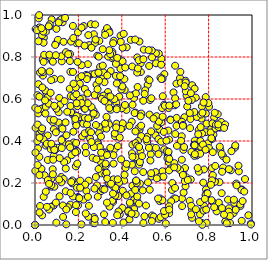
| Category | y wykres |
|---|---|
| 0.595156333497665 | 0.573 |
| 0.0 | 0 |
| 0.6885195955051244 | 0.513 |
| 0.7686208502139633 | 0.01 |
| 0.17133730488844923 | 0.198 |
| 0.0 | 0 |
| 0.39359969500127345 | 0.744 |
| 0.39717534863096915 | 0.703 |
| 0.375502533048806 | 0.482 |
| 0.1647447185980644 | 0.614 |
| 0.5332731022230875 | 0.337 |
| 0.09676642713919814 | 0.865 |
| 0.5173381343364102 | 0.396 |
| 0.0 | 0 |
| 0.44139861103197064 | 0.094 |
| 0.2579029819581121 | 0.956 |
| 0.7882438199083921 | 0.169 |
| 0.3029363502844006 | 0.161 |
| 0.3665575476958771 | 0.361 |
| 0.16306868091016113 | 0.729 |
| 0.5292788364736167 | 0.595 |
| 0.011467501616257425 | 0.618 |
| 0.0 | 0 |
| 0.020958516006236327 | 0.435 |
| 0.6169734149224206 | 0.299 |
| 0.6854858364601307 | 0.26 |
| 0.0589720041967573 | 0.31 |
| 0.48610777583849585 | 0.352 |
| 0.32900162032509783 | 0.341 |
| 0.8766625762106434 | 0.016 |
| 0.6155212446640451 | 0.557 |
| 0.005378145765442377 | 0.254 |
| 0.19865823551639417 | 0.133 |
| 0.7366285990639404 | 0.402 |
| 0.5739438314274691 | 0.456 |
| 0.4372969176489593 | 0.066 |
| 0.08570173656289648 | 0.093 |
| 0.3104388231552151 | 0.46 |
| 0.0 | 0 |
| 0.0 | 0 |
| 0.811707751439313 | 0.456 |
| 0.0 | 0 |
| 0.0 | 0 |
| 0.0 | 0 |
| 0.7970631233592428 | 0.389 |
| 0.18965817422453413 | 0.202 |
| 0.04431707109298155 | 0.563 |
| 0.2494150667135896 | 0.857 |
| 0.0 | 0 |
| 0.7757191672186811 | 0.202 |
| 0.2657520407859022 | 0.32 |
| 0.08152979641203051 | 0.265 |
| 0.9466348261789832 | 0.09 |
| 0.0 | 0 |
| 0.4110165986825157 | 0.212 |
| 0.22345351486812093 | 0.121 |
| 0.0 | 0 |
| 0.18825623695239402 | 0.279 |
| 0.5178212850032925 | 0.42 |
| 0.0 | 0 |
| 0.07900252235229088 | 0.781 |
| 0.5704608825235218 | 0.489 |
| 0.0728605069764795 | 0.087 |
| 0.0 | 0 |
| 0.0862923871927902 | 0.329 |
| 0.3592843563848892 | 0.11 |
| 0.7675511702534963 | 0.507 |
| 0.19727930188021048 | 0.51 |
| 0.22716374956621743 | 0.555 |
| 0.0 | 0 |
| 0.22199986153720297 | 0.482 |
| 0.8541284013746843 | 0.357 |
| 0.3881053016917948 | 0.79 |
| 0.9150355595004286 | 0.057 |
| 0.7873026059592866 | 0.139 |
| 0.7421153306515681 | 0.375 |
| 0.5956930373246876 | 0.361 |
| 0.0 | 0 |
| 0.7607289662879398 | 0.051 |
| 0.4413163206051708 | 0.882 |
| 0.0 | 0 |
| 0.6541920801000015 | 0.377 |
| 0.0 | 0 |
| 0.023333731022755932 | 0.09 |
| 0.1608136580234384 | 0.781 |
| 0.09862647201231844 | 0.934 |
| 0.1727185494731598 | 0.527 |
| 0.34951323499654885 | 0.549 |
| 0.2472469719349818 | 0.211 |
| 0.48350653171994085 | 0.197 |
| 0.37762215343723193 | 0.557 |
| 0.677402270309556 | 0.126 |
| 0.3510573572169713 | 0.207 |
| 0.0 | 0 |
| 0.0 | 0 |
| 0.8896387859335202 | 0.121 |
| 0.10981754436351587 | 0.488 |
| 0.5766772161984283 | 0.237 |
| 0.9833386107245164 | 0.046 |
| 0.7908794285423901 | 0.01 |
| 0.0 | 0 |
| 0.04072576067504796 | 0.892 |
| 0.27556417863034766 | 0.532 |
| 0.8502060630857499 | 0.204 |
| 0.0 | 0 |
| 0.5825554038144221 | 0.791 |
| 0.0 | 0 |
| 0.21904186383360147 | 0.603 |
| 0.7871956056563801 | 0.531 |
| 0.6984876003136892 | 0.617 |
| 0.8220733808104578 | 0.431 |
| 0.06462107313685306 | 0.074 |
| 0.0 | 0 |
| 0.0 | 0 |
| 0.48209326938159547 | 0.454 |
| 0.010546998915361261 | 0.399 |
| 0.55585268740819 | 0.427 |
| 0.3563658531563273 | 0.794 |
| 0.3943318753851275 | 0.902 |
| 0.6114963629401723 | 0.332 |
| 0.035762473990057386 | 0.788 |
| 0.7868007260229806 | 0.442 |
| 0.7208870339370846 | 0.348 |
| 0.11327522359810749 | 0.137 |
| 0.11203771261251438 | 0.605 |
| 0.3225437619157687 | 0.346 |
| 0.0 | 0 |
| 0.12937776201493856 | 0.038 |
| 0.0 | 0 |
| 0.7794501088063771 | 0.09 |
| 0.30418551038580677 | 0.298 |
| 0.36892939769919564 | 0.422 |
| 0.029820838806128958 | 0.268 |
| 0.33486641753719837 | 0.491 |
| 0.5688018261508931 | 0.409 |
| 0.0 | 0 |
| 0.0 | 0 |
| 0.7544130027953414 | 0.453 |
| 0.0 | 0 |
| 0.28343642789744594 | 0.668 |
| 0.695585211673965 | 0.229 |
| 0.3720562080553167 | 0.139 |
| 0.6464937996499207 | 0.433 |
| 0.0 | 0 |
| 0.40878132126357125 | 0.91 |
| 0.2024910767613628 | 0.699 |
| 0.1978996951507277 | 0.917 |
| 0.0 | 0 |
| 0.0 | 0 |
| 0.6518590124788647 | 0.673 |
| 0.4457824974003516 | 0.492 |
| 0.03998519542707679 | 0.134 |
| 0.5604815555638752 | 0.518 |
| 0.5740371922106263 | 0.114 |
| 0.14406822556387733 | 0.003 |
| 0.80197122457899 | 0.564 |
| 0.4566451397965048 | 0.12 |
| 0.3565922999602217 | 0.824 |
| 0.5403556352259219 | 0.825 |
| 0.4798955981573706 | 0.288 |
| 0.48721401229981975 | 0.77 |
| 0.4895688019926061 | 0.423 |
| 0.19111007750782993 | 0.866 |
| 0.0 | 0 |
| 0.0758718913322538 | 0.221 |
| 0.0 | 0 |
| 0.0 | 0 |
| 0.2435666157616645 | 0.766 |
| 0.562960107413229 | 0.472 |
| 0.37303791334114655 | 0.768 |
| 0.42186332974798935 | 0.286 |
| 0.9025222845307982 | 0.261 |
| 0.27126066880289557 | 0.038 |
| 0.8100323506578163 | 0.441 |
| 0.0 | 0 |
| 0.47454575383200104 | 0.4 |
| 0.14811980732485064 | 0.308 |
| 0.01525626622182119 | 0.532 |
| 0.41333519886499503 | 0.643 |
| 0.24582108117069368 | 0.039 |
| 0.23266971102267964 | 0.372 |
| 0.0 | 0 |
| 0.8370627931553972 | 0.065 |
| 0.9677706148915555 | 0.219 |
| 0.4812344437167917 | 0.874 |
| 0.5706177165314976 | 0.816 |
| 0.0 | 0 |
| 0.7906706780027649 | 0.483 |
| 0.0 | 0 |
| 0.6108439298324833 | 0.346 |
| 0.46671866797281003 | 0.316 |
| 0.0 | 0 |
| 0.0 | 0 |
| 0.08677005602828103 | 0.456 |
| 0.332752333190821 | 0.918 |
| 0.8663776764621534 | 0.328 |
| 0.0 | 0 |
| 0.5870246345805046 | 0.256 |
| 0.07650090884035632 | 0.182 |
| 0.175105164314302 | 0.532 |
| 0.7241231349461472 | 0.666 |
| 0.47129533740857565 | 0.798 |
| 0.07682176319440459 | 0.979 |
| 0.5348369509635977 | 0.446 |
| 0.0 | 0 |
| 0.253887082119572 | 0.412 |
| 0.777061019253081 | 0.069 |
| 0.8155193914322048 | 0.271 |
| 0.21461757736804243 | 0.761 |
| 0.38807244632719395 | 0.611 |
| 0.4490294752150058 | 0.382 |
| 0.6329880216551783 | 0.2 |
| 0.7212015410892673 | 0.596 |
| 0.46475390424118446 | 0.323 |
| 0.2086235694756784 | 0.211 |
| 0.12336351698994097 | 0.779 |
| 0.2751316975243019 | 0.619 |
| 0.0 | 0 |
| 0.11979732160855594 | 0.212 |
| 0.7356183763723242 | 0.649 |
| 0.0 | 0 |
| 0.0 | 0 |
| 0.06743240341618428 | 0.946 |
| 0.02030466577215162 | 0.324 |
| 0.08217272593958358 | 0.49 |
| 0.20043754700145655 | 0.13 |
| 0.4320743096703036 | 0.067 |
| 0.12119667517928012 | 0.229 |
| 0.3474504787875389 | 0.809 |
| 0.0 | 0 |
| 0.09619855776001685 | 0.441 |
| 0.3120858410807352 | 0.279 |
| 0.7410212046657405 | 0.607 |
| 0.26942823256497395 | 0.544 |
| 0.2578178938764071 | 0.717 |
| 0.0 | 0 |
| 0.9533521737170186 | 0.169 |
| 0.0 | 0 |
| 0.4627076476332037 | 0.535 |
| 0.05305133941874551 | 0.627 |
| 0.032642562285527865 | 0.904 |
| 0.7451339187093207 | 0.514 |
| 0.9183188112436315 | 0.106 |
| 0.717909749716205 | 0.217 |
| 0.13209377668349964 | 0.219 |
| 0.31465618168985265 | 0.704 |
| 0.0 | 0 |
| 0.3241559988935515 | 0.92 |
| 0.7319873457040196 | 0.382 |
| 0.7162447556060165 | 0.505 |
| 0.5558570119708117 | 0.252 |
| 0.3035060586359203 | 0.611 |
| 0.1629436631434632 | 0.097 |
| 0.8582138620368743 | 0.49 |
| 0.4634530249903618 | 0.39 |
| 0.16623698824522315 | 0.537 |
| 0.40361847548248275 | 0.78 |
| 0.10578226923420952 | 0.882 |
| 0.5391978335185812 | 0.045 |
| 0.16410971552536702 | 0.567 |
| 0.1884658456995122 | 0.062 |
| 0.20633151766446534 | 0.601 |
| 0.3693640355847321 | 0.148 |
| 0.42135165495390037 | 0.548 |
| 0.4419113298122952 | 0.15 |
| 0.0 | 0 |
| 0.8255154891589763 | 0.512 |
| 0.5193622570658065 | 0.668 |
| 0.0397689208373152 | 0.868 |
| 0.0 | 0 |
| 0.21811305264918113 | 0.422 |
| 0.0 | 0 |
| 0.0 | 0 |
| 0.5960910867822353 | 0.719 |
| 0.0 | 0 |
| 0.7709270331202953 | 0.001 |
| 0.8287449134229038 | 0.208 |
| 0.029704475515036965 | 0.45 |
| 0.0 | 0 |
| 0.9248204566748391 | 0.072 |
| 0.05769598233121287 | 0.608 |
| 0.15161825064148915 | 0.085 |
| 0.9525851419505952 | 0.02 |
| 0.5463921768882142 | 0.04 |
| 0.0 | 0 |
| 0.0 | 0 |
| 0.456842753817301 | 0.076 |
| 0.3906694753739498 | 0.05 |
| 0.0 | 0 |
| 0.1746180230980806 | 0.948 |
| 0.5712694087205182 | 0.029 |
| 0.0 | 0 |
| 0.3151468429718359 | 0.343 |
| 0.47962823560456114 | 0.464 |
| 0.0 | 0 |
| 0.2998814046949826 | 0.753 |
| 0.3746544656032046 | 0.581 |
| 0.0 | 0 |
| 0.4776384694025565 | 0.785 |
| 0.0 | 0 |
| 0.4321066288306318 | 0.069 |
| 0.09218626392992557 | 0.356 |
| 0.6423072945921035 | 0.295 |
| 0.723796857851313 | 0.034 |
| 0.48774582794565124 | 0.729 |
| 0.0 | 0 |
| 0.08396756021632767 | 0.311 |
| 0.22462127479357308 | 0.947 |
| 0.19507414121697397 | 0.292 |
| 0.5814944473723835 | 0.397 |
| 0.33966996361542234 | 0.927 |
| 0.002559236698768008 | 0.462 |
| 0.020028804267735345 | 0.941 |
| 0.0 | 0 |
| 0.03633561233620353 | 0.711 |
| 0.0 | 0 |
| 0.04990974137047233 | 0.159 |
| 0.6766233410461063 | 0.311 |
| 0.45889693492589456 | 0.533 |
| 0.0 | 0 |
| 0.0 | 0 |
| 0.0 | 0 |
| 0.02302559343860655 | 0.726 |
| 0.6315267713792033 | 0.167 |
| 0.33195980383533485 | 0.938 |
| 0.0 | 0 |
| 0.4080438292242097 | 0.012 |
| 0.33707040796256393 | 0.802 |
| 0.0 | 0 |
| 0.3384054754973237 | 0.576 |
| 0.0 | 0 |
| 0.0 | 0 |
| 0.0 | 0 |
| 0.6123889150302428 | 0.321 |
| 0.9209596851691609 | 0.368 |
| 0.8485833364785449 | 0.09 |
| 0.0 | 0 |
| 0.0 | 0 |
| 0.28895544047600286 | 0.393 |
| 0.0 | 0 |
| 0.7145529129899972 | 0.461 |
| 0.5877259222901027 | 0.696 |
| 0.7131778000038129 | 0.115 |
| 0.0 | 0 |
| 0.0 | 0 |
| 0.9948719451280921 | 0.007 |
| 0.33845048537849876 | 0.199 |
| 0.6180885767642564 | 0.056 |
| 0.7866662066161386 | 0.609 |
| 0.8288429500784003 | 0.206 |
| 0.6949161694245096 | 0.637 |
| 0.0 | 0 |
| 0.8515367868780247 | 0.373 |
| 0.8940508090499022 | 0.08 |
| 0.44697252301946166 | 0.342 |
| 0.04804399763854894 | 0.64 |
| 0.8470736436626006 | 0.107 |
| 0.816278657289002 | 0.409 |
| 0.21458076765926337 | 0.94 |
| 0.4491511254979036 | 0.325 |
| 0.012044700109383855 | 0.478 |
| 0.30713513452219576 | 0.246 |
| 0.0 | 0 |
| 0.0 | 0 |
| 0.3987087372117215 | 0.646 |
| 0.05884420460734796 | 0.426 |
| 0.017128265818089128 | 0.984 |
| 0.0 | 0 |
| 0.0 | 0 |
| 0.9459669638826153 | 0.098 |
| 0.17723673454356026 | 0.611 |
| 0.0 | 0 |
| 0.7457680055787491 | 0.331 |
| 0.07111581948335144 | 0.797 |
| 0.0 | 0 |
| 0.1269540877493176 | 0.411 |
| 0.6071173478497507 | 0.351 |
| 0.3603409054227026 | 0.801 |
| 0.4546618234904939 | 0.62 |
| 0.3102665003042222 | 0.326 |
| 0.3768633381609343 | 0.188 |
| 0.27118030109297464 | 0.908 |
| 0.0 | 0 |
| 0.6179236459948844 | 0.407 |
| 0.6103514903791866 | 0.318 |
| 0.07049897195972954 | 0.502 |
| 0.0 | 0 |
| 0.23385930645473318 | 0.055 |
| 0.6433515583291819 | 0.57 |
| 0.0363511032645486 | 0.728 |
| 0.3423725729335292 | 0.197 |
| 0.2298388110927434 | 0.648 |
| 0.0 | 0 |
| 0.5724766755407938 | 0.228 |
| 0.0 | 0 |
| 0.7224184441679138 | 0.596 |
| 0.0 | 0 |
| 0.40255920344237806 | 0.66 |
| 0.4989182399159854 | 0.592 |
| 0.1779519788531364 | 0.393 |
| 0.7621380349895587 | 0.4 |
| 0.0 | 0 |
| 0.0 | 0 |
| 0.5277987141255607 | 0.526 |
| 0.47058902345238296 | 0.114 |
| 0.19560597238766753 | 0.566 |
| 0.0 | 0 |
| 0.03308017625574089 | 0.46 |
| 0.28057768812048123 | 0.228 |
| 0.49940208934391705 | 0.789 |
| 0.6405389021577622 | 0.127 |
| 0.6482085061257566 | 0.126 |
| 0.0 | 0 |
| 0.36138620581702374 | 0.333 |
| 0.0 | 0 |
| 0.3294651198823578 | 0.515 |
| 0.0 | 0 |
| 0.17175247427747475 | 0.212 |
| 0.0 | 0 |
| 0.039497811390171056 | 0.407 |
| 0.0 | 0 |
| 0.08244537131362639 | 0.778 |
| 0.0 | 0 |
| 0.0 | 0 |
| 0.40462270460454186 | 0.466 |
| 0.3904393996330049 | 0.416 |
| 0.08246979057051418 | 0.241 |
| 0.40462728551617555 | 0.484 |
| 0.8420015836537227 | 0.528 |
| 0.12172464421239537 | 0.203 |
| 0.9394799089038317 | 0.255 |
| 0.34355169501237404 | 0.088 |
| 0.2368740880076865 | 0.162 |
| 0.5782266909237724 | 0.701 |
| 0.296401181120606 | 0.877 |
| 0.03287095190526368 | 0.046 |
| 0.9273067153477627 | 0.197 |
| 0.0 | 0 |
| 0.7787532900229479 | 0.264 |
| 0.43541746296400285 | 0.472 |
| 0.6237565009495698 | 0.502 |
| 0.8985589689040527 | 0.009 |
| 0.5372728662055881 | 0.231 |
| 0.0 | 0 |
| 0.19193620024622016 | 0.353 |
| 0.1868737952097359 | 0.488 |
| 0.1418484342898203 | 0.161 |
| 0.4727755639596207 | 0.657 |
| 0.1122980494313428 | 0.972 |
| 0.0 | 0 |
| 0.5139918935695308 | 0.408 |
| 0.7344279913698759 | 0.538 |
| 0.41561503116383436 | 0.75 |
| 0.31163677320854033 | 0.171 |
| 0.27567148416812604 | 0.867 |
| 0.0014344438736714205 | 0.558 |
| 0.7511183156397054 | 0.345 |
| 0.49679896779196964 | 0.165 |
| 0.02913175898681597 | 0.553 |
| 0.0 | 0 |
| 0.4637592821444988 | 0.052 |
| 0.0 | 0 |
| 0.3408845465700755 | 0.479 |
| 0.0 | 0 |
| 0.6912818491752317 | 0.271 |
| 0.0 | 0 |
| 0.28557458796964885 | 0.189 |
| 0.20346211957414218 | 0.865 |
| 0.14486601308197833 | 0.428 |
| 0.08123925002634358 | 0.361 |
| 0.2311223481792779 | 0.192 |
| 0.0 | 0 |
| 0.7652015511080377 | 0.526 |
| 0.27917138427045163 | 0.883 |
| 0.0015684956763475366 | 0.258 |
| 0.0 | 0 |
| 0.6055511904177446 | 0.402 |
| 0.17517214739776676 | 0.136 |
| 0.2064721924029893 | 0.673 |
| 0.0 | 0 |
| 0.08835126415487482 | 0.696 |
| 0.0 | 0 |
| 0.7231681220806949 | 0.074 |
| 0.12716865331517146 | 0.965 |
| 0.20653152895533866 | 0.514 |
| 0.0 | 0 |
| 0.12154707289763012 | 0.804 |
| 0.8930864584141052 | 0.064 |
| 0.627423558757249 | 0.113 |
| 0.34710398682987065 | 0.368 |
| 0.0 | 0 |
| 0.8015879096210621 | 0.367 |
| 0.0 | 0 |
| 0.0 | 0 |
| 0.34315687182769194 | 0.916 |
| 0.7691504297986245 | 0.565 |
| 0.0 | 0 |
| 0.33615809751888304 | 0.633 |
| 0.04998109468920431 | 0.92 |
| 0.0 | 0 |
| 0.3997557050550685 | 0.556 |
| 0.23546816332626608 | 0.715 |
| 0.8836719736122551 | 0.008 |
| 0.17511143580393718 | 0.729 |
| 0.6762618293377597 | 0.423 |
| 0.8669109224537292 | 0.274 |
| 0.4312025708832664 | 0.06 |
| 0.5287590560188995 | 0.168 |
| 0.8179564878041871 | 0.484 |
| 0.4706948761211459 | 0.726 |
| 0.0 | 0 |
| 0.04920666018669573 | 0.379 |
| 0.0 | 0 |
| 0.054467529383979696 | 0.387 |
| 0.326252512333305 | 0.282 |
| 0.020952817512413624 | 0.416 |
| 0.280623115233653 | 0.525 |
| 0.0 | 0 |
| 0.08907039977295927 | 0.182 |
| 0.4562927423077019 | 0.605 |
| 0.12829950662904288 | 0.392 |
| 0.365833088190913 | 0.599 |
| 0.2910036343388449 | 0.384 |
| 0.9375196139179313 | 0.282 |
| 0.0 | 0 |
| 0.5386257766812995 | 0.019 |
| 0.6383114463896163 | 0.631 |
| 0.0 | 0 |
| 0.6682902121599171 | 0.699 |
| 0.3147573979450359 | 0.728 |
| 0.6698336389766663 | 0.729 |
| 0.0 | 0 |
| 0.0 | 0 |
| 0.0 | 0 |
| 0.4027131827750724 | 0.081 |
| 0.0 | 0 |
| 0.6721337961173426 | 0.678 |
| 0.015818216952515174 | 0.671 |
| 0.0 | 0 |
| 0.602886984406713 | 0.007 |
| 0.0 | 0 |
| 0.6521096999178381 | 0.472 |
| 0.0 | 0 |
| 0.6836831854901643 | 0.358 |
| 0.31236633044679085 | 0.759 |
| 0.4223286849884147 | 0.846 |
| 0.21391189196127014 | 0.003 |
| 0.7888485097059134 | 0.074 |
| 0.31809042815285515 | 0.051 |
| 0.038010578890817825 | 0.921 |
| 0.22956560188647213 | 0.511 |
| 0.0 | 0 |
| 0.2683353463862509 | 0.01 |
| 0.0 | 0 |
| 0.5788043869570811 | 0.037 |
| 0.5217210810866841 | 0.694 |
| 0.6937523403052627 | 0.687 |
| 0.15632921806178135 | 0.384 |
| 0.582859279675222 | 0.695 |
| 0.5400544835994555 | 0.369 |
| 0.07552772383376882 | 0.19 |
| 0.0725833305313377 | 0.361 |
| 0.6249008268229695 | 0.269 |
| 0.43710041395663113 | 0.106 |
| 0.7369485878064332 | 0.383 |
| 0.36201288064421855 | 0.292 |
| 0.7648976030275842 | 0.373 |
| 0.40375955429922905 | 0.844 |
| 0.28825714596494034 | 0.647 |
| 0.0 | 0 |
| 0.5014734854449034 | 0.835 |
| 0.4710860932633085 | 0.135 |
| 0.9051523466424645 | 0.351 |
| 0.3774877368079982 | 0.558 |
| 0.2448892384104635 | 0.709 |
| 0.16907474913454856 | 0.333 |
| 0.19805697630603092 | 0.093 |
| 0.0 | 0 |
| 0.49859642678091265 | 0.252 |
| 0.31849263144929296 | 0.593 |
| 0.320320746706087 | 0.68 |
| 0.0 | 0 |
| 0.01208499148843245 | 0.286 |
| 0.0 | 0 |
| 0.0 | 0 |
| 0.8982153717538564 | 0.042 |
| 0.4468185084540951 | 0.287 |
| 0.0 | 0 |
| 0.0 | 0 |
| 0.5076932210058406 | 0.641 |
| 0.4170260905836901 | 0.272 |
| 0.47125443409554346 | 0.378 |
| 0.12229296554682734 | 0.405 |
| 0.013919943083515962 | 0.365 |
| 0.3487074934574542 | 0.733 |
| 0.1043818539049578 | 0.368 |
| 0.7197911972314153 | 0.091 |
| 0.2406663069910241 | 0.71 |
| 0.1617937256408155 | 0.37 |
| 0.22893859553570428 | 0.437 |
| 0.0 | 0 |
| 0.45961608114184827 | 0.256 |
| 0.7694235299345906 | 0.436 |
| 0.6766881123397062 | 0.492 |
| 0.6525907457161738 | 0.51 |
| 0.5573313985606927 | 0.818 |
| 0.0 | 0 |
| 0.5261874707899292 | 0.757 |
| 0.8822270574086455 | 0.311 |
| 0.16119766308476557 | 0.814 |
| 0.9516615141842548 | 0.167 |
| 0.0 | 0 |
| 0.2744161005781931 | 0.008 |
| 0.7181830031827666 | 0.628 |
| 0.37251933207055177 | 0.205 |
| 0.6144613629579938 | 0.45 |
| 0.36733847873890413 | 0.436 |
| 0.4627848571364611 | 0.446 |
| 0.6849111329048754 | 0.155 |
| 0.0 | 0 |
| 0.0 | 0 |
| 0.13419757885140193 | 0.3 |
| 0.33304156405787066 | 0.712 |
| 0.483686291454577 | 0.3 |
| 0.1935727282943106 | 0.178 |
| 0.0 | 0 |
| 0.46503484860060673 | 0.627 |
| 0.12310464915211694 | 0.464 |
| 0.23066946378969788 | 0.553 |
| 0.32442377291077906 | 0.241 |
| 0.39599080291572974 | 0.457 |
| 0.044435817313667525 | 0.237 |
| 0.5996683174914854 | 0.048 |
| 0.042303972147945124 | 0.81 |
| 0.23465702067705008 | 0.343 |
| 0.3231362295424305 | 0.905 |
| 0.2484448956538997 | 0.091 |
| 0.34246119846312295 | 0.557 |
| 0.0 | 0 |
| 0.29465827552143264 | 0.467 |
| 0.04959882619951794 | 0.562 |
| 0.00298031739349236 | 0.933 |
| 0.10898655662049928 | 0.537 |
| 0.0 | 0 |
| 0.0 | 0 |
| 0.2569814433183847 | 0.512 |
| 0.033749041862790485 | 0.655 |
| 0.0 | 0 |
| 0.7899356726178576 | 0.151 |
| 0.0 | 0 |
| 0.6189239936988392 | 0.315 |
| 0.8281587664755325 | 0.534 |
| 0.3155074186294875 | 0.616 |
| 0.0 | 0 |
| 0.33829282571273733 | 0.611 |
| 0.5380226453771261 | 0.831 |
| 0.0 | 0 |
| 0.3729914200311658 | 0.71 |
| 0.19213086124997536 | 0.519 |
| 0.11606413189342712 | 0.573 |
| 0.06804373711819756 | 0.955 |
| 0.0 | 0 |
| 0.0 | 0 |
| 0.0 | 0 |
| 0.0 | 0 |
| 0.0206275219217944 | 0.06 |
| 0.19444759808009882 | 0.35 |
| 0.624071344804655 | 0.5 |
| 0.5362493458575254 | 0.604 |
| 0.5577418992393419 | 0.77 |
| 0.0 | 0 |
| 0.1263524005491281 | 0.458 |
| 0.0 | 0 |
| 0.35860334369438096 | 0.01 |
| 0.1417937057599663 | 0.269 |
| 0.0 | 0 |
| 0.08463160960252403 | 0.371 |
| 0.6945284497038107 | 0.678 |
| 0.44961471051905544 | 0.572 |
| 0.4045241479503463 | 0.163 |
| 0.557435585071002 | 0.367 |
| 0.0932351916595826 | 0.858 |
| 0.0 | 0 |
| 0.18894759079710088 | 0.095 |
| 0.6686532759867897 | 0.261 |
| 0.5826137648784158 | 0.489 |
| 0.0 | 0 |
| 0.3593580521350276 | 0.184 |
| 0.752108317602883 | 0.432 |
| 0.1907799392569286 | 0.623 |
| 0.581439957752219 | 0.763 |
| 0.2892059086922909 | 0.135 |
| 0.05493442616949418 | 0.086 |
| 0.05899645756857275 | 0.214 |
| 0.6895332785684417 | 0.661 |
| 0.8323298746536416 | 0.46 |
| 0.0 | 0 |
| 0.414649240274518 | 0.572 |
| 0.7738755907998599 | 0.383 |
| 0.17691235808053163 | 0.444 |
| 0.48993595579085236 | 0.531 |
| 0.4119627887792652 | 0.695 |
| 0.6457331207183901 | 0.759 |
| 0.8177263221088926 | 0.111 |
| 0.19050032632449865 | 0.474 |
| 0.0 | 0 |
| 0.28718363529777513 | 0.806 |
| 0.14284760574477662 | 0.823 |
| 0.44911302372753614 | 0.187 |
| 0.0 | 0 |
| 0.6179000452325372 | 0.089 |
| 0.9228907330305326 | 0.379 |
| 0.5768779821408462 | 0.126 |
| 0.2988488526990002 | 0.371 |
| 0.19604867629504097 | 0.777 |
| 0.524793289084907 | 0.367 |
| 0.0 | 0 |
| 0.4352031479450781 | 0.027 |
| 0.0 | 0 |
| 0.8622648309585567 | 0.254 |
| 0.8335709020214965 | 0.477 |
| 0.5236471814857829 | 0.833 |
| 0.09648061136942132 | 0.107 |
| 0.07529112649313563 | 0.387 |
| 0.8522368820210106 | 0.463 |
| 0.1285086578968091 | 0.093 |
| 0.5936168434891609 | 0.443 |
| 0.9567547624811817 | 0.114 |
| 0.5856657515876 | 0.557 |
| 0.7716208421648891 | 0.535 |
| 0.0 | 0 |
| 0.5985582680545161 | 0.568 |
| 0.7129859083939244 | 0.533 |
| 0.0 | 0 |
| 0.32982105228265335 | 0.249 |
| 0.645713327602318 | 0.603 |
| 0.28056003518491124 | 0.476 |
| 0.5349487580386955 | 0.247 |
| 0.4615629724103858 | 0.883 |
| 0.0 | 0 |
| 0.3840421797355461 | 0.138 |
| 0.06344433333342758 | 0.578 |
| 0.23976572965977117 | 0.478 |
| 0.3559584560278989 | 0.816 |
| 0.6869403506374385 | 0.372 |
| 0.3564605695817402 | 0.116 |
| 0.42126666709954286 | 0.141 |
| 0.0 | 0 |
| 0.02032716184888217 | 0.238 |
| 0.6937732724547413 | 0.185 |
| 0.2458111796458312 | 0.904 |
| 0.7342496474345015 | 0.329 |
| 0.38173189927047424 | 0.376 |
| 0.6903110746118821 | 0.209 |
| 0.01892109783113416 | 0.999 |
| 0.7194401362555791 | 0.05 |
| 0.0021416495547236236 | 0.345 |
| 0.0 | 0 |
| 0.5317067060366703 | 0.307 |
| 0.3968816265411691 | 0.313 |
| 0.31982859961414545 | 0.169 |
| 0.7607703547015515 | 0.109 |
| 0.4933331129665559 | 0.328 |
| 0.11388177994631166 | 0.318 |
| 0.3315125376300486 | 0.106 |
| 0.26056569816036235 | 0.562 |
| 0.0 | 0 |
| 0.0 | 0 |
| 0.28346321274947406 | 0.723 |
| 0.42169649504685003 | 0.291 |
| 0.019929460086714368 | 0.611 |
| 0.704149465135327 | 0.214 |
| 0.0 | 0 |
| 0.0 | 0 |
| 0.2741562582802318 | 0.173 |
| 0.16610870626835317 | 0.873 |
| 0.20804065528793758 | 0.177 |
| 0.12114054494068871 | 0.98 |
| 0.5946149300728192 | 0.066 |
| 0.672968961436219 | 0.401 |
| 0.2742234909989427 | 0.719 |
| 0.0 | 0 |
| 0.0 | 0 |
| 0.11127436597899387 | 0.217 |
| 0.23912618768851623 | 0.695 |
| 0.96419292384491 | 0.159 |
| 0.38746294086355093 | 0.201 |
| 0.7611814194601764 | 0.339 |
| 0.8761057259064098 | 0.478 |
| 0.27554393338673655 | 0.029 |
| 0.3625914760038116 | 0.878 |
| 0.0 | 0 |
| 0.3048754023683372 | 0.344 |
| 0.5690752015931008 | 0.338 |
| 0.0 | 0 |
| 0.2712690754514624 | 0.371 |
| 0.32376525208558093 | 0.014 |
| 0.6154232991465262 | 0.349 |
| 0.5115426317516333 | 0.093 |
| 0.015851940755986726 | 0.875 |
| 0.48683981367370466 | 0.518 |
| 0.06751177988602064 | 0.731 |
| 0.0 | 0 |
| 0.0 | 0 |
| 0.0 | 0 |
| 0.0 | 0 |
| 0.03991583533508314 | 0.777 |
| 0.37009287346769637 | 0.14 |
| 0.8465203742821176 | 0.466 |
| 0.44781014768312755 | 0.755 |
| 0.5705960279548449 | 0.493 |
| 0.16413131795331337 | 0.153 |
| 0.2952925192294612 | 0.437 |
| 0.2602290801381013 | 0.844 |
| 0.5916185692261728 | 0.23 |
| 0.819306127833733 | 0.347 |
| 0.0 | 0 |
| 0.2925898041682541 | 0.726 |
| 0.6781581511422099 | 0.09 |
| 0.0 | 0 |
| 0.3847960475026423 | 0.064 |
| 0.15306655010040682 | 0.814 |
| 0.0 | 0 |
| 0.37075437241363085 | 0.177 |
| 0.2936559949308758 | 0.802 |
| 0.6453204223702553 | 0.177 |
| 0.0 | 0 |
| 0.37638271507949717 | 0.551 |
| 0.3289726122772172 | 0.459 |
| 0.3077611945658333 | 0.6 |
| 0.8603368541371176 | 0.339 |
| 0.0 | 0 |
| 0.0 | 0 |
| 0.8129467584126844 | 0.413 |
| 0.0 | 0 |
| 0.26991924429136993 | 0.531 |
| 0.16699170342376235 | 0.205 |
| 0.5612919089383163 | 0.222 |
| 0.0 | 0 |
| 0.7015525153329929 | 0.564 |
| 0.26016767373916394 | 0.395 |
| 0.0 | 0 |
| 0.49959529561773297 | 0.01 |
| 0.24985890862846172 | 0.449 |
| 0.7989190276163001 | 0.581 |
| 0.588280084118615 | 0.516 |
| 0.741509778068205 | 0.075 |
| 0.3329376308008195 | 0.221 |
| 0.24332693366170277 | 0.58 |
| 0.8440836541323274 | 0.479 |
| 0.8600981117778724 | 0.152 |
| 0.0 | 0 |
| 0.0 | 0 |
| 0.0 | 0 |
| 0.20404442914675125 | 0.128 |
| 0.3463741155922455 | 0.814 |
| 0.8195329013734921 | 0.237 |
| 0.37705007905865917 | 0.674 |
| 0.6177750805220191 | 0.26 |
| 0.04621574712939114 | 0.594 |
| 0.4373585928988166 | 0.617 |
| 0.2831384247494989 | 0.313 |
| 0.8134117504604663 | 0.118 |
| 0.08920120609543059 | 0.358 |
| 0.06634323345954507 | 0.811 |
| 0.14858498637009665 | 0.539 |
| 0.5052116288789513 | 0.624 |
| 0.0 | 0 |
| 0.861602337953262 | 0.081 |
| 0.09596617757925019 | 0.809 |
| 0.0 | 0 |
| 0.0 | 0 |
| 0.04776814502652815 | 0.531 |
| 0.21468580353974975 | 0.581 |
| 0.0 | 0 |
| 0.47973438883006914 | 0.372 |
| 0.3952279775556248 | 0.872 |
| 0.16040594479300752 | 0.649 |
| 0.013470443233598695 | 0.55 |
| 0.5390091388392309 | 0.798 |
| 0.2948591419164487 | 0.688 |
| 0.7548867584629647 | 0.254 |
| 0.5872623228950776 | 0.118 |
| 0.25831493461206223 | 0.442 |
| 0.0 | 0 |
| 0.063369467705221 | 0.946 |
| 0.9950313729274204 | 0.003 |
| 0.47933484938103943 | 0.102 |
| 0.7768136370001564 | 0.583 |
| 0.749412625553726 | 0.271 |
| 0.342309537587673 | 0.832 |
| 0.13849867982763864 | 0.986 |
| 0.681626044289789 | 0.476 |
| 0.30400691674889113 | 0.421 |
| 0.6563369793206906 | 0.273 |
| 0.36197125695747023 | 0.217 |
| 0.0 | 0 |
| 0.3317730556010887 | 0.333 |
| 0.18807909407441148 | 0.655 |
| 0.09838970156385152 | 0.011 |
| 0.008851098814382508 | 0.927 |
| 0.0 | 0 |
| 0.030774524122236913 | 0.734 |
| 0.8715052620665845 | 0.462 |
| 0.5045206640536201 | 0.042 |
| 0.0 | 0 |
| 0.0 | 0 |
| 0.0 | 0 |
| 0.9165187841888004 | 0.12 |
| 0.6504429135324589 | 0.574 |
| 0.2282887094839824 | 0.854 |
| 0.5275355243492549 | 0.69 |
| 0.8156113573337803 | 0.213 |
| 0.5670889614153539 | 0.126 |
| 0.29280609678917724 | 0.266 |
| 0.8257302511906275 | 0.085 |
| 0.0 | 0 |
| 0.0 | 0 |
| 0.3228657450122977 | 0.483 |
| 0.6183580979204394 | 0.074 |
| 0.2769841697917077 | 0.955 |
| 0.34722217681590495 | 0.612 |
| 0.5205497100612252 | 0.203 |
| 0.17674764114608454 | 0.891 |
| 0.7369133416792208 | 0.337 |
| 0.12343580171746016 | 0.367 |
| 0.10906743980617117 | 0.964 |
| 0.07181574672832614 | 0.629 |
| 0.24546561033714442 | 0.508 |
| 0.359967693258884 | 0.866 |
| 0.7353978639639832 | 0.38 |
| 0.13603986582965855 | 0.59 |
| 0.41259486409487056 | 0.239 |
| 0.32536455145322163 | 0.292 |
| 0.1407953405281137 | 0.489 |
| 0.4742476534303449 | 0.745 |
| 0.3505956933281402 | 0.197 |
| 0.07446715433895879 | 0.69 |
| 0.6186826425656541 | 0.569 |
| 0.0 | 0 |
| 0.0 | 0 |
| 0.3920483588143566 | 0.709 |
| 0.8106301066492532 | 0.191 |
| 0.0 | 0 |
| 0.11875407804865001 | 0.694 |
| 0.46884684242953956 | 0.2 |
| 0.4296407708028077 | 0.066 |
| 0.46547575944998265 | 0.212 |
| 0.46620348161585967 | 0.212 |
| 0.4893332602351461 | 0.473 |
| 0.1858800665246808 | 0.346 |
| 0.6412390270764217 | 0.275 |
| 0.38125406658898964 | 0.218 |
| 0.7861369430790848 | 0.359 |
| 0.0 | 0 |
| 0.09841499333018999 | 0.554 |
| 0.37392123384281784 | 0.465 |
| 0.03008215765907818 | 0.937 |
| 0.0 | 0 |
| 0.1316853774504977 | 0.872 |
| 0.0 | 0 |
| 0.8308658568260177 | 0.281 |
| 0.7552648098929838 | 0.018 |
| 0.7860497889286676 | 0.143 |
| 0.0 | 0 |
| 0.7951059314068488 | 0.151 |
| 0.5461616896555396 | 0.507 |
| 0.706896098317255 | 0.591 |
| 0.0 | 0 |
| 0.21446441842459352 | 0.709 |
| 0.8711915300069295 | 0.049 |
| 0.7632047435291769 | 0.466 |
| 0.0 | 0 |
| 0.5888192889272099 | 0.613 |
| 0.37892422303497497 | 0.796 |
| 0.9290136276791721 | 0.189 |
| 0.24393523695136965 | 0.134 |
| 0.32029007839952606 | 0.591 |
| 0.37873782867149974 | 0.047 |
| 0.0884496517227078 | 0.568 |
| 0.8937132701715831 | 0.266 |
| 0.35931283129968117 | 0.149 |
| 0.0 | 0 |
| 0.4450006872341308 | 0.054 |
| 0.06499224140210502 | 0.196 |
| 0.08669467446656431 | 0.501 |
| 0.18561203637258028 | 0.505 |
| 0.0 | 0 |
| 0.681654561590188 | 0.472 |
| 0.18956114032851135 | 0.391 |
| 0.31201446705396163 | 0.837 |
| 0.0 | 0 |
| 0.1776714487655494 | 0.673 |
| 0.46174957980227793 | 0.167 |
| 0.0 | 0 |
| 0.2421571891887465 | 0.627 |
| 0.6816269860382428 | 0.238 |
| 0.782608798682636 | 0.124 |
| 0.1442614150472845 | 0.074 |
| 0.19156837477759003 | 0.58 |